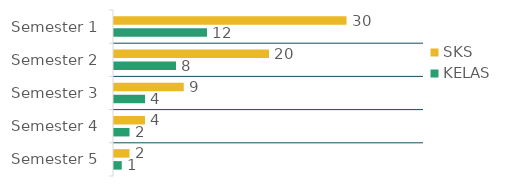
| Category | SKS | KELAS |
|---|---|---|
| Semester 1 | 30 | 12 |
| Semester 2 | 20 | 8 |
| Semester 3 | 9 | 4 |
| Semester 4 | 4 | 2 |
| Semester 5 | 2 | 1 |